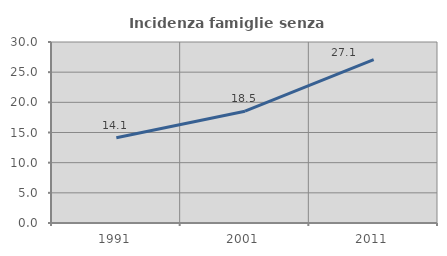
| Category | Incidenza famiglie senza nuclei |
|---|---|
| 1991.0 | 14.116 |
| 2001.0 | 18.529 |
| 2011.0 | 27.086 |